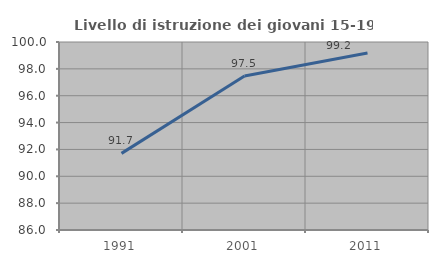
| Category | Livello di istruzione dei giovani 15-19 anni |
|---|---|
| 1991.0 | 91.707 |
| 2001.0 | 97.468 |
| 2011.0 | 99.187 |